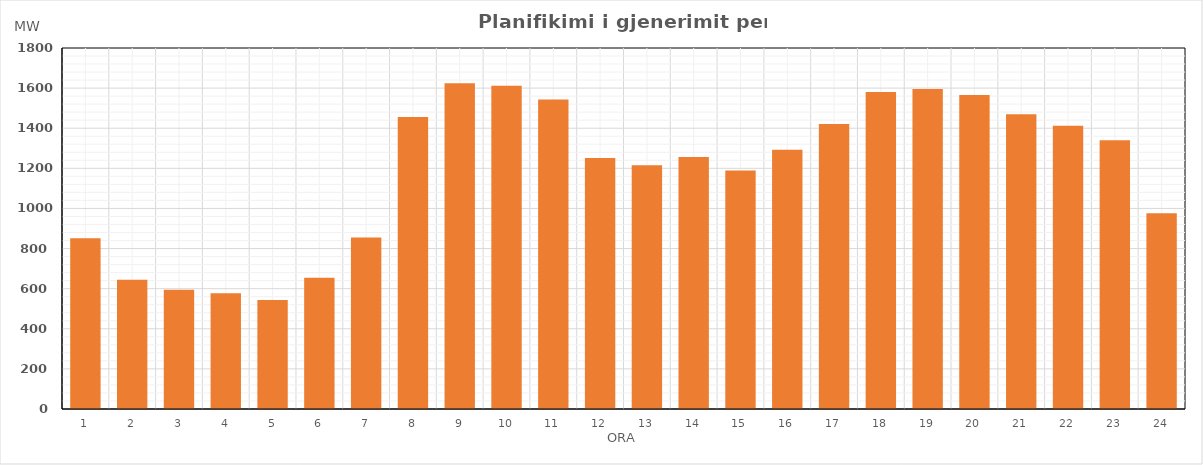
| Category | Max (MW) |
|---|---|
| 0 | 851.592 |
| 1 | 644.212 |
| 2 | 594.551 |
| 3 | 577.061 |
| 4 | 543.309 |
| 5 | 654.564 |
| 6 | 854.674 |
| 7 | 1455.393 |
| 8 | 1623.815 |
| 9 | 1611.263 |
| 10 | 1542.903 |
| 11 | 1251.366 |
| 12 | 1215.965 |
| 13 | 1256.034 |
| 14 | 1188.988 |
| 15 | 1292.976 |
| 16 | 1421.461 |
| 17 | 1580.691 |
| 18 | 1595.539 |
| 19 | 1566.227 |
| 20 | 1470.09 |
| 21 | 1412.096 |
| 22 | 1340.047 |
| 23 | 975.971 |